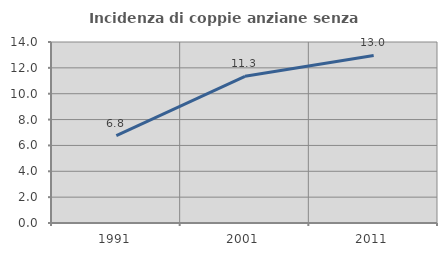
| Category | Incidenza di coppie anziane senza figli  |
|---|---|
| 1991.0 | 6.765 |
| 2001.0 | 11.346 |
| 2011.0 | 12.961 |